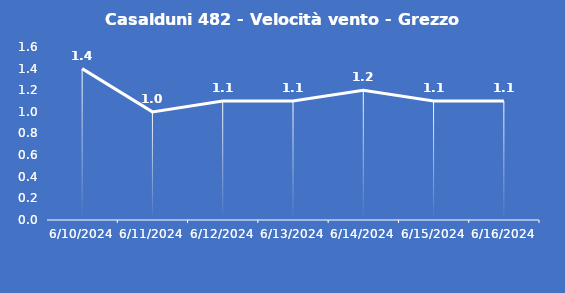
| Category | Casalduni 482 - Velocità vento - Grezzo (m/s) |
|---|---|
| 6/10/24 | 1.4 |
| 6/11/24 | 1 |
| 6/12/24 | 1.1 |
| 6/13/24 | 1.1 |
| 6/14/24 | 1.2 |
| 6/15/24 | 1.1 |
| 6/16/24 | 1.1 |